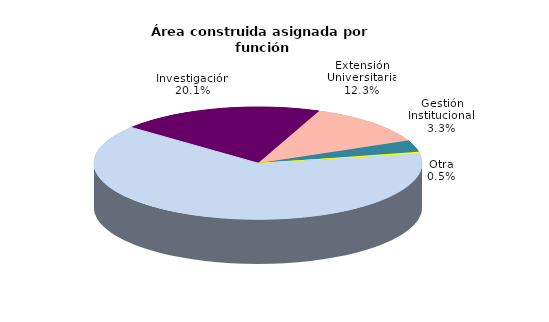
| Category | Series 0 |
|---|---|
| Docencia | 63.738 |
| Investigación | 20.116 |
| Extensión Universitaria | 12.311 |
| Gestión Institucional | 3.339 |
| Otra | 0.495 |